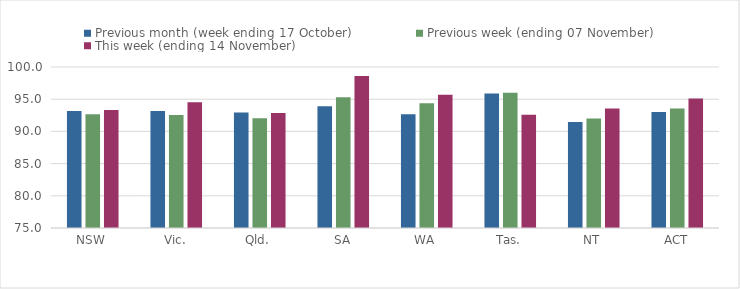
| Category | Previous month (week ending 17 October) | Previous week (ending 07 November) | This week (ending 14 November) |
|---|---|---|---|
| NSW | 93.16 | 92.66 | 93.32 |
| Vic. | 93.15 | 92.56 | 94.52 |
| Qld. | 92.92 | 92.04 | 92.85 |
| SA | 93.92 | 95.29 | 98.62 |
| WA | 92.65 | 94.38 | 95.71 |
| Tas. | 95.9 | 95.99 | 92.57 |
| NT | 91.46 | 92.01 | 93.57 |
| ACT | 93.02 | 93.54 | 95.09 |